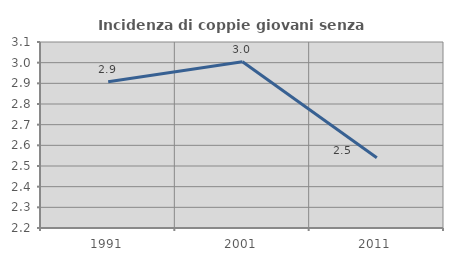
| Category | Incidenza di coppie giovani senza figli |
|---|---|
| 1991.0 | 2.907 |
| 2001.0 | 3.004 |
| 2011.0 | 2.54 |